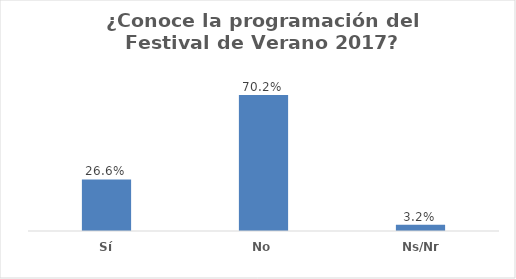
| Category | Series 0 |
|---|---|
| Sí | 0.266 |
| No | 0.702 |
| Ns/Nr | 0.032 |